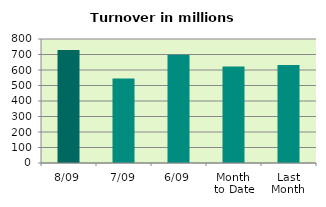
| Category | Series 0 |
|---|---|
| 8/09 | 729.495 |
| 7/09 | 545.944 |
| 6/09 | 698.659 |
| Month 
to Date | 623.203 |
| Last
Month | 632.895 |